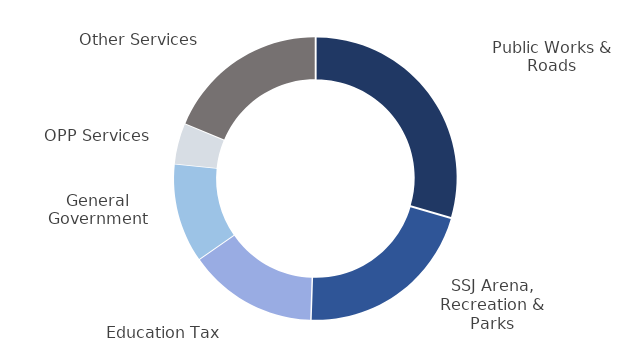
| Category | Series 0 |
|---|---|
| 0 | 458.253 |
| 1 | 325.635 |
| 2 | 229.5 |
| 3 | 175.661 |
| 4 | 72.099 |
| 5 | 290.253 |